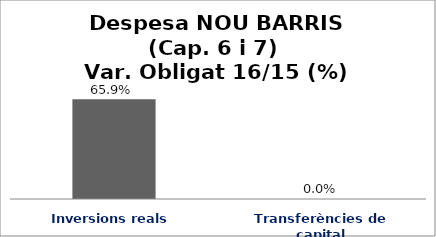
| Category | Series 0 |
|---|---|
| Inversions reals | 0.659 |
| Transferències de capital | 0 |